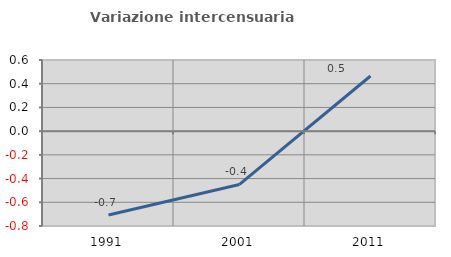
| Category | Variazione intercensuaria annua |
|---|---|
| 1991.0 | -0.707 |
| 2001.0 | -0.449 |
| 2011.0 | 0.465 |